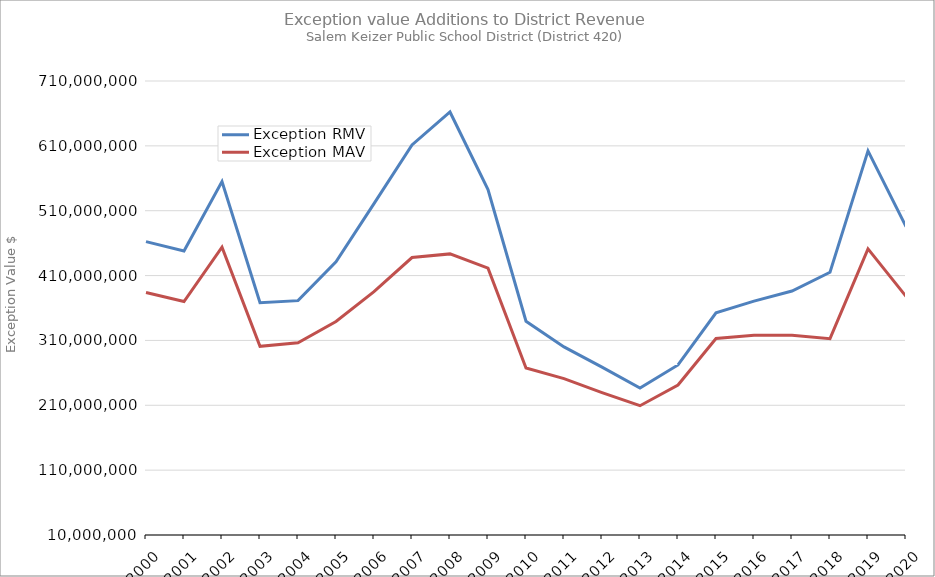
| Category | Exception RMV | Exception MAV |
|---|---|---|
| 2000.0 | 462273089 | 383781761 |
| 2001.0 | 447826957 | 370044351 |
| 2002.0 | 554993355 | 453807246 |
| 2003.0 | 368178597 | 300938251 |
| 2004.0 | 371348759 | 306384132 |
| 2005.0 | 431373112 | 339169725 |
| 2006.0 | 520829330 | 385184407 |
| 2007.0 | 611463409 | 437811007 |
| 2008.0 | 662217355 | 443424756 |
| 2009.0 | 542535559 | 421497189 |
| 2010.0 | 339546579 | 267496169 |
| 2011.0 | 299984462 | 251191940 |
| 2012.0 | 268829192 | 229581299 |
| 2013.0 | 236681627 | 209337630 |
| 2014.0 | 272179109 | 241205913 |
| 2015.0 | 352668462 | 313021002 |
| 2016.0 | 370627907 | 318016057 |
| 2017.0 | 386125152 | 317911683 |
| 2018.0 | 415168881 | 312682829 |
| 2019.0 | 602275772 | 451067268 |
| 2020.0 | 485461133 | 377955215 |